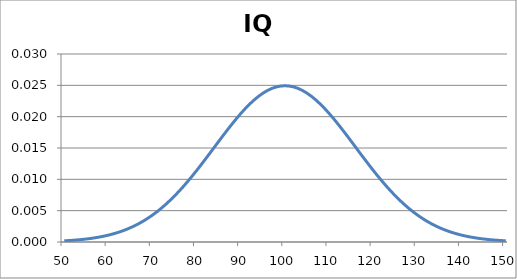
| Category | f(x) |
|---|---|
| 50.0 | 0 |
| 51.0 | 0 |
| 52.0 | 0 |
| 53.0 | 0 |
| 54.0 | 0 |
| 55.0 | 0 |
| 56.0 | 0.001 |
| 57.0 | 0.001 |
| 58.0 | 0.001 |
| 59.0 | 0.001 |
| 60.0 | 0.001 |
| 61.0 | 0.001 |
| 62.0 | 0.001 |
| 63.0 | 0.002 |
| 64.0 | 0.002 |
| 65.0 | 0.002 |
| 66.0 | 0.003 |
| 67.0 | 0.003 |
| 68.0 | 0.003 |
| 69.0 | 0.004 |
| 70.0 | 0.004 |
| 71.0 | 0.005 |
| 72.0 | 0.005 |
| 73.0 | 0.006 |
| 74.0 | 0.007 |
| 75.0 | 0.007 |
| 76.0 | 0.008 |
| 77.0 | 0.009 |
| 78.0 | 0.01 |
| 79.0 | 0.011 |
| 80.0 | 0.011 |
| 81.0 | 0.012 |
| 82.0 | 0.013 |
| 83.0 | 0.014 |
| 84.0 | 0.015 |
| 85.0 | 0.016 |
| 86.0 | 0.017 |
| 87.0 | 0.018 |
| 88.0 | 0.019 |
| 89.0 | 0.02 |
| 90.0 | 0.021 |
| 91.0 | 0.021 |
| 92.0 | 0.022 |
| 93.0 | 0.023 |
| 94.0 | 0.023 |
| 95.0 | 0.024 |
| 96.0 | 0.024 |
| 97.0 | 0.024 |
| 98.0 | 0.025 |
| 99.0 | 0.025 |
| 100.0 | 0.025 |
| 101.0 | 0.025 |
| 102.0 | 0.025 |
| 103.0 | 0.024 |
| 104.0 | 0.024 |
| 105.0 | 0.024 |
| 106.0 | 0.023 |
| 107.0 | 0.023 |
| 108.0 | 0.022 |
| 109.0 | 0.021 |
| 110.0 | 0.021 |
| 111.0 | 0.02 |
| 112.0 | 0.019 |
| 113.0 | 0.018 |
| 114.0 | 0.017 |
| 115.0 | 0.016 |
| 116.0 | 0.015 |
| 117.0 | 0.014 |
| 118.0 | 0.013 |
| 119.0 | 0.012 |
| 120.0 | 0.011 |
| 121.0 | 0.011 |
| 122.0 | 0.01 |
| 123.0 | 0.009 |
| 124.0 | 0.008 |
| 125.0 | 0.007 |
| 126.0 | 0.007 |
| 127.0 | 0.006 |
| 128.0 | 0.005 |
| 129.0 | 0.005 |
| 130.0 | 0.004 |
| 131.0 | 0.004 |
| 132.0 | 0.003 |
| 133.0 | 0.003 |
| 134.0 | 0.003 |
| 135.0 | 0.002 |
| 136.0 | 0.002 |
| 137.0 | 0.002 |
| 138.0 | 0.001 |
| 139.0 | 0.001 |
| 140.0 | 0.001 |
| 141.0 | 0.001 |
| 142.0 | 0.001 |
| 143.0 | 0.001 |
| 144.0 | 0.001 |
| 145.0 | 0 |
| 146.0 | 0 |
| 147.0 | 0 |
| 148.0 | 0 |
| 149.0 | 0 |
| 150.0 | 0 |